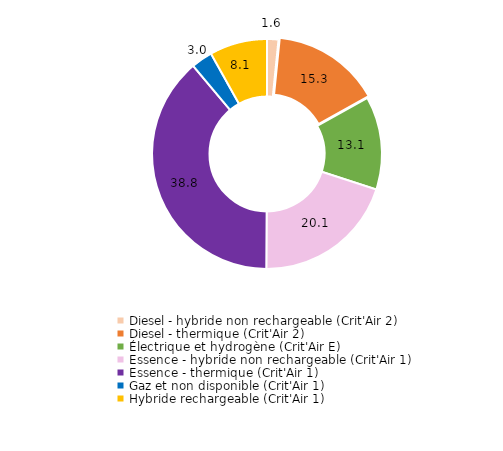
| Category | Series 0 |
|---|---|
| Diesel - hybride non rechargeable (Crit'Air 2) | 1.6 |
| Diesel - thermique (Crit'Air 2) | 15.3 |
| Électrique et hydrogène (Crit'Air E) | 13.1 |
| Essence - hybride non rechargeable (Crit'Air 1) | 20.1 |
| Essence - thermique (Crit'Air 1) | 38.8 |
| Gaz et non disponible (Crit'Air 1) | 3 |
| Hybride rechargeable (Crit'Air 1) | 8.1 |